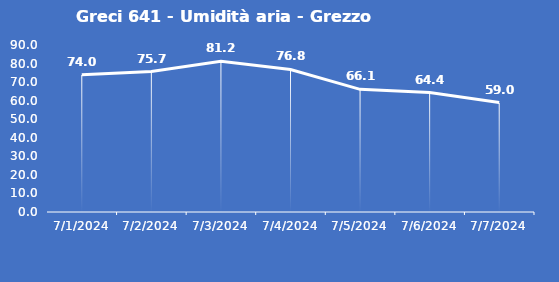
| Category | Greci 641 - Umidità aria - Grezzo (%) |
|---|---|
| 7/1/24 | 74 |
| 7/2/24 | 75.7 |
| 7/3/24 | 81.2 |
| 7/4/24 | 76.8 |
| 7/5/24 | 66.1 |
| 7/6/24 | 64.4 |
| 7/7/24 | 59 |